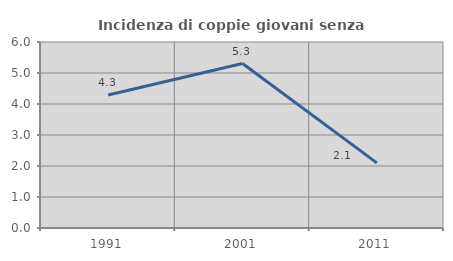
| Category | Incidenza di coppie giovani senza figli |
|---|---|
| 1991.0 | 4.29 |
| 2001.0 | 5.305 |
| 2011.0 | 2.101 |